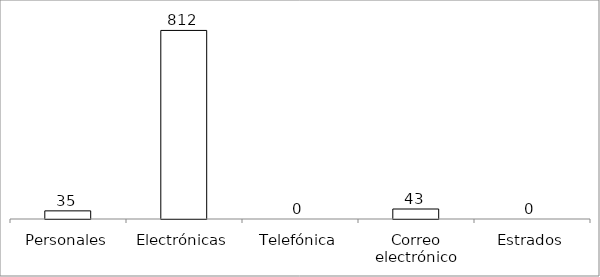
| Category | Series 0 |
|---|---|
| Personales | 35 |
| Electrónicas | 812 |
| Telefónica | 0 |
| Correo electrónico | 43 |
| Estrados | 0 |